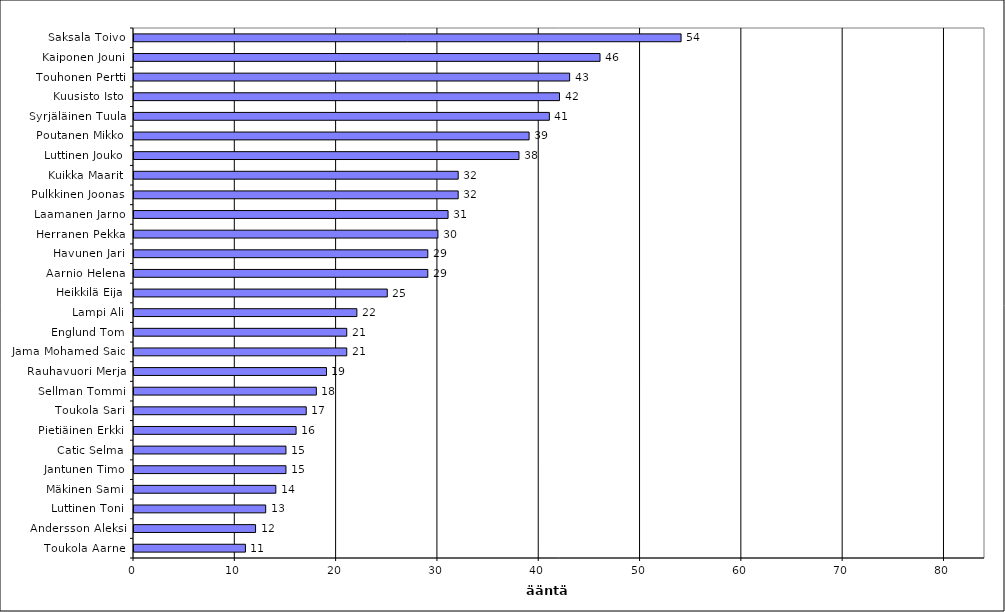
| Category | Series 0 |
|---|---|
| Saksala Toivo | 54 |
| Kaiponen Jouni | 46 |
| Touhonen Pertti | 43 |
| Kuusisto Isto | 42 |
| Syrjäläinen Tuula | 41 |
| Poutanen Mikko | 39 |
| Luttinen Jouko | 38 |
| Kuikka Maarit | 32 |
| Pulkkinen Joonas | 32 |
| Laamanen Jarno | 31 |
| Herranen Pekka | 30 |
| Havunen Jari | 29 |
| Aarnio Helena | 29 |
| Heikkilä Eija | 25 |
| Lampi Ali | 22 |
| Englund Tom | 21 |
| Jama Mohamed Said | 21 |
| Rauhavuori Merja | 19 |
| Sellman Tommi | 18 |
| Toukola Sari | 17 |
| Pietiäinen Erkki | 16 |
| Catic Selma | 15 |
| Jantunen Timo | 15 |
| Mäkinen Sami | 14 |
| Luttinen Toni | 13 |
| Andersson Aleksi | 12 |
| Toukola Aarne | 11 |